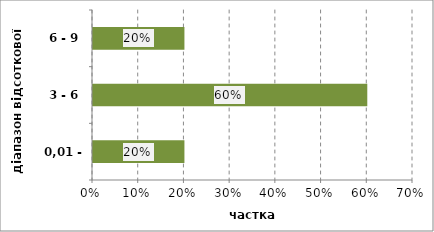
| Category | Series 0 |
|---|---|
| 0,01 - 3 | 0.2 |
| 3 - 6 | 0.6 |
| 6 - 9 | 0.2 |